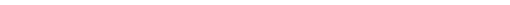
| Category | Series 0 |
|---|---|
| Space Heating | 86.146 |
| Space Cooling | 0 |